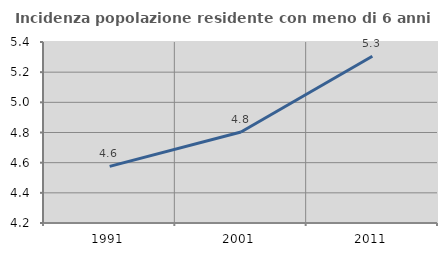
| Category | Incidenza popolazione residente con meno di 6 anni |
|---|---|
| 1991.0 | 4.575 |
| 2001.0 | 4.803 |
| 2011.0 | 5.306 |